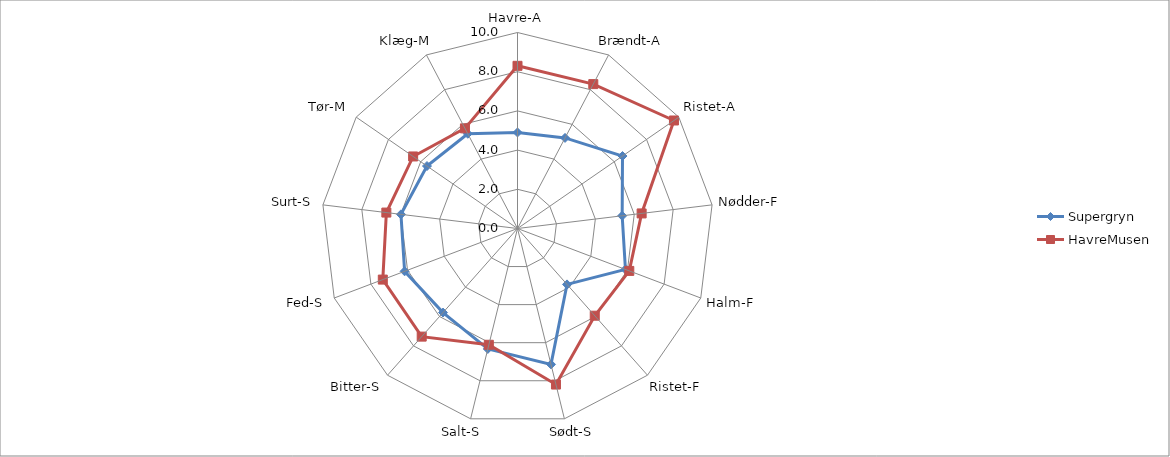
| Category | Supergryn | HavreMusen |
|---|---|---|
| Havre-A | 4.9 | 8.3 |
| Brændt-A | 5.22 | 8.32 |
| Ristet-A | 6.51 | 9.7 |
| Nødder-F | 5.38 | 6.38 |
| Halm-F | 5.89 | 6.1 |
| Ristet-F | 3.81 | 5.944 |
| Sødt-S | 7.14 | 8.2 |
| Salt-S | 6.33 | 6.11 |
| Bitter-S | 5.73 | 7.37 |
| Fed-S | 6.16 | 7.35 |
| Surt-S | 5.99 | 6.74 |
| Tør-M | 5.611 | 6.47 |
| Klæg-M | 5.46 | 5.77 |